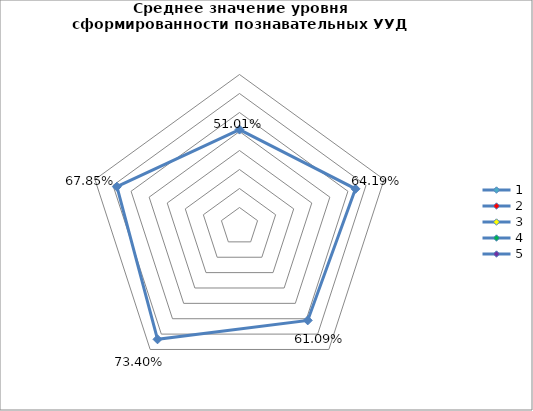
| Category | Series 0 |
|---|---|
| 0 | 0.51 |
| 1 | 0.642 |
| 2 | 0.611 |
| 3 | 0.734 |
| 4 | 0.678 |